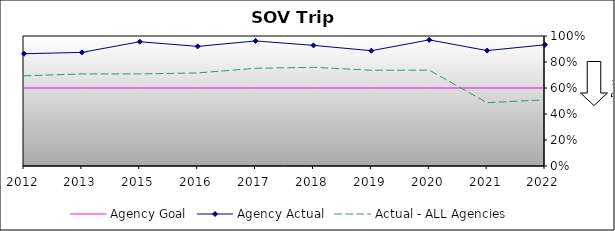
| Category | Agency Goal | Agency Actual | Actual - ALL Agencies |
|---|---|---|---|
| 2012.0 | 0.6 | 0.864 | 0.694 |
| 2013.0 | 0.6 | 0.874 | 0.708 |
| 2015.0 | 0.6 | 0.956 | 0.708 |
| 2016.0 | 0.6 | 0.92 | 0.716 |
| 2017.0 | 0.6 | 0.962 | 0.752 |
| 2018.0 | 0.6 | 0.928 | 0.759 |
| 2019.0 | 0.6 | 0.887 | 0.736 |
| 2020.0 | 0.6 | 0.97 | 0.737 |
| 2021.0 | 0.6 | 0.888 | 0.487 |
| 2022.0 | 0.6 | 0.932 | 0.509 |